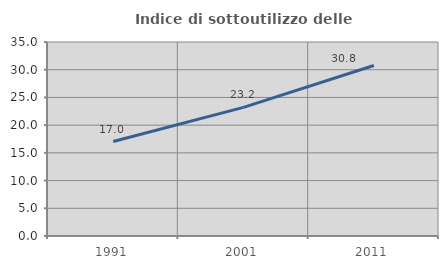
| Category | Indice di sottoutilizzo delle abitazioni  |
|---|---|
| 1991.0 | 17.035 |
| 2001.0 | 23.199 |
| 2011.0 | 30.762 |